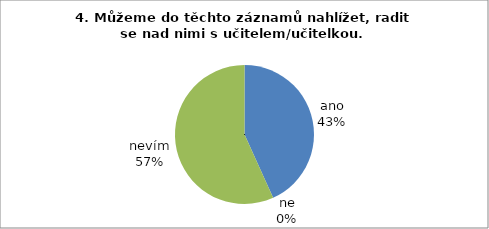
| Category | 4. Můžeme do těchto záznamů nahlížet, radit se nad nimi s učitelem/učitelkou. |
|---|---|
| ano | 16 |
| ne | 0 |
| nevím | 21 |